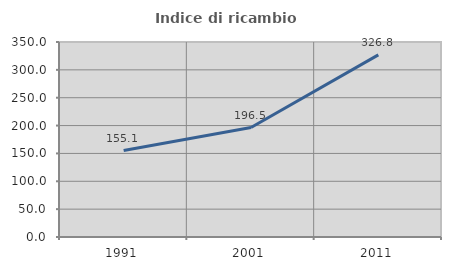
| Category | Indice di ricambio occupazionale  |
|---|---|
| 1991.0 | 155.135 |
| 2001.0 | 196.454 |
| 2011.0 | 326.829 |